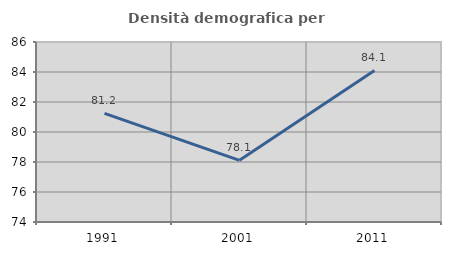
| Category | Densità demografica |
|---|---|
| 1991.0 | 81.237 |
| 2001.0 | 78.112 |
| 2011.0 | 84.102 |